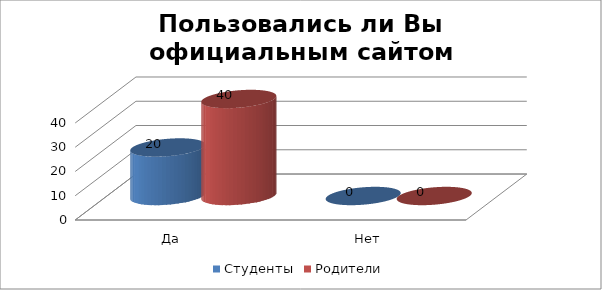
| Category | Студенты | Родители |
|---|---|---|
| Да | 20 | 40 |
| Нет | 0 | 0 |